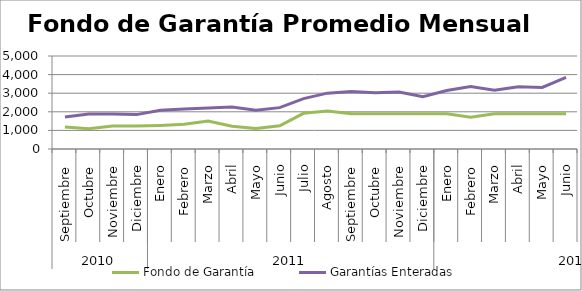
| Category | Fondo de Garantía | Garantías Enteradas |
|---|---|---|
| 0 | 1186.765 | 1723.136 |
| 1 | 1091.277 | 1878.561 |
| 2 | 1240.142 | 1886.493 |
| 3 | 1233.184 | 1848.941 |
| 4 | 1267.175 | 2079.773 |
| 5 | 1328.315 | 2151.804 |
| 6 | 1507.218 | 2200.488 |
| 7 | 1222.61 | 2253.818 |
| 8 | 1097.438 | 2081.441 |
| 9 | 1248.758 | 2223.666 |
| 10 | 1917.982 | 2706.525 |
| 11 | 2038.339 | 3002.384 |
| 12 | 1900.513 | 3095.395 |
| 13 | 1900.513 | 3029.373 |
| 14 | 1900.513 | 3060.179 |
| 15 | 1900.513 | 2809.042 |
| 16 | 1896.798 | 3141.641 |
| 17 | 1714.423 | 3362.648 |
| 18 | 1900.513 | 3154.118 |
| 19 | 1900.513 | 3348.058 |
| 20 | 1898.685 | 3308.859 |
| 21 | 1900.513 | 3850.375 |